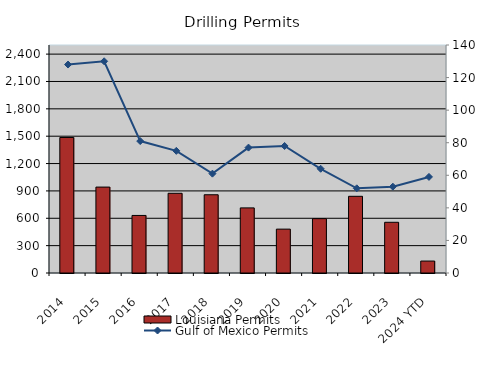
| Category | Louisiana Permits |
|---|---|
| 2014 | 1486 |
| 2015 | 942 |
| 2016 | 631 |
| 2017 | 874 |
| 2018 | 858 |
| 2019 | 714 |
| 2020 | 481 |
| 2021 | 596 |
| 2022 | 841 |
| 2023 | 556 |
| 2024 YTD | 131 |